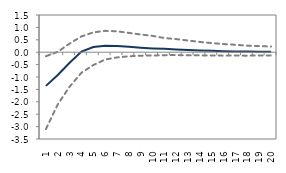
| Category | lower bound | median | upper bound |
|---|---|---|---|
| 1.0 | -3.1 | -1.357 | -0.161 |
| 2.0 | -2.105 | -0.916 | 0.016 |
| 3.0 | -1.39 | -0.426 | 0.347 |
| 4.0 | -0.826 | 0.027 | 0.638 |
| 5.0 | -0.518 | 0.209 | 0.799 |
| 6.0 | -0.296 | 0.258 | 0.861 |
| 7.0 | -0.211 | 0.253 | 0.843 |
| 8.0 | -0.166 | 0.218 | 0.778 |
| 9.0 | -0.139 | 0.181 | 0.714 |
| 10.0 | -0.134 | 0.152 | 0.658 |
| 11.0 | -0.121 | 0.134 | 0.571 |
| 12.0 | -0.115 | 0.11 | 0.528 |
| 13.0 | -0.126 | 0.086 | 0.47 |
| 14.0 | -0.128 | 0.071 | 0.414 |
| 15.0 | -0.131 | 0.057 | 0.367 |
| 16.0 | -0.139 | 0.043 | 0.329 |
| 17.0 | -0.134 | 0.031 | 0.299 |
| 18.0 | -0.14 | 0.025 | 0.265 |
| 19.0 | -0.133 | 0.018 | 0.244 |
| 20.0 | -0.128 | 0.014 | 0.229 |